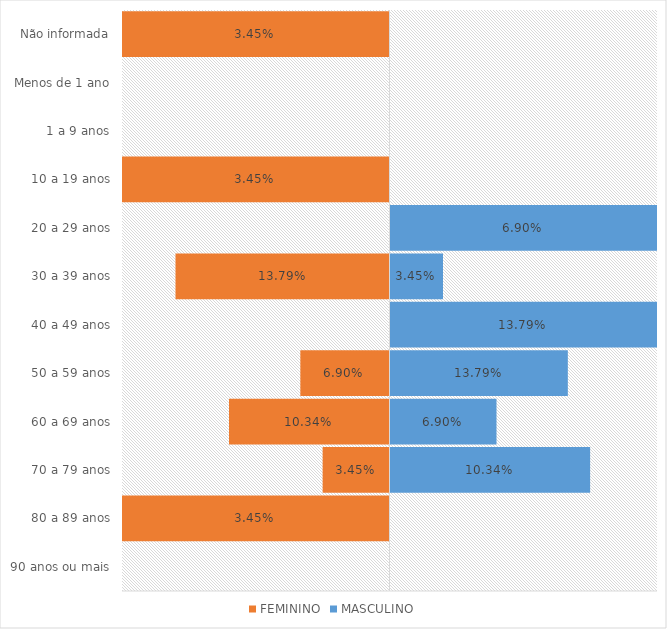
| Category | FEMININO | MASCULINO |
|---|---|---|
| 90 anos ou mais | 0 | 0 |
| 80 a 89 anos | -0.034 | 0 |
| 70 a 79 anos | -0.034 | 0.103 |
| 60 a 69 anos | -0.103 | 0.069 |
| 50 a 59 anos | -0.069 | 0.138 |
| 40 a 49 anos | 0 | 0.138 |
| 30 a 39 anos | -0.138 | 0.034 |
| 20 a 29 anos | 0 | 0.069 |
| 10 a 19 anos | -0.034 | 0 |
| 1 a 9 anos | 0 | 0 |
| Menos de 1 ano | 0 | 0 |
| Não informada | -0.034 | 0 |